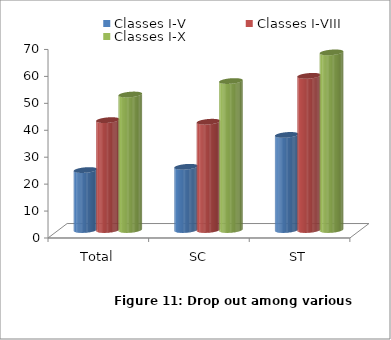
| Category | Classes I-V | Classes I-VIII | Classes I-X |
|---|---|---|---|
| Total | 22.261 | 40.793 | 50.309 |
| SC | 23.47 | 40.197 | 55.312 |
| ST | 35.299 | 57.242 | 65.949 |